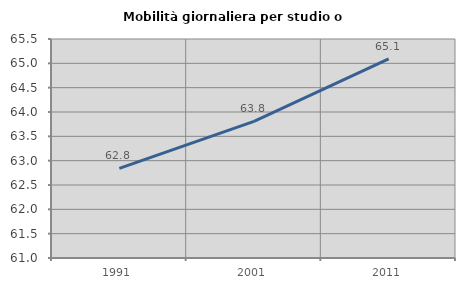
| Category | Mobilità giornaliera per studio o lavoro |
|---|---|
| 1991.0 | 62.842 |
| 2001.0 | 63.808 |
| 2011.0 | 65.091 |